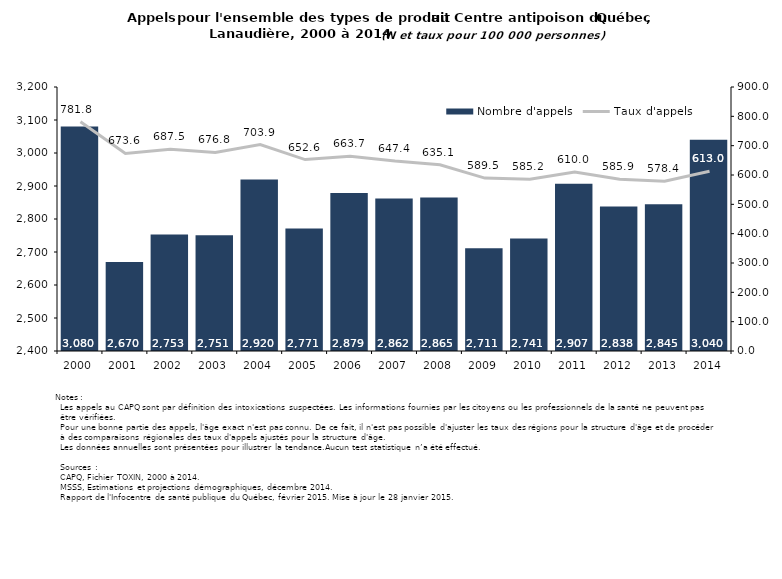
| Category | Nombre d'appels |
|---|---|
| 2000.0 | 3080 |
| 2001.0 | 2670 |
| 2002.0 | 2753 |
| 2003.0 | 2751 |
| 2004.0 | 2920 |
| 2005.0 | 2771 |
| 2006.0 | 2879 |
| 2007.0 | 2862 |
| 2008.0 | 2865 |
| 2009.0 | 2711 |
| 2010.0 | 2741 |
| 2011.0 | 2907 |
| 2012.0 | 2838 |
| 2013.0 | 2845 |
| 2014.0 | 3040 |